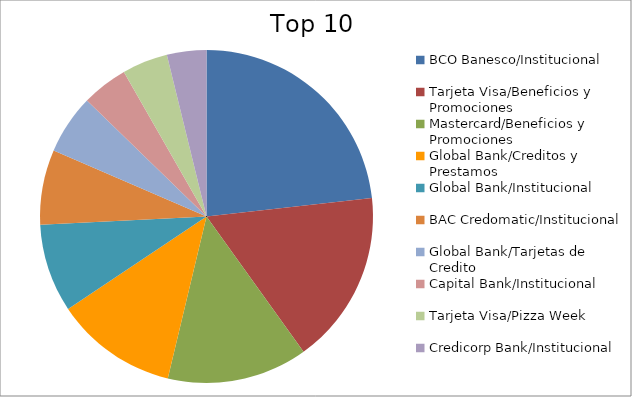
| Category | Series 0 |
|---|---|
| BCO Banesco/Institucional | 17.7 |
| Tarjeta Visa/Beneficios y Promociones | 12.87 |
| Mastercard/Beneficios y Promociones | 10.4 |
| Global Bank/Creditos y Prestamos | 9.06 |
| Global Bank/Institucional | 6.54 |
| BAC Credomatic/Institucional | 5.56 |
| Global Bank/Tarjetas de Credito | 4.39 |
| Capital Bank/Institucional | 3.42 |
| Tarjeta Visa/Pizza Week | 3.38 |
| Credicorp Bank/Institucional | 2.92 |